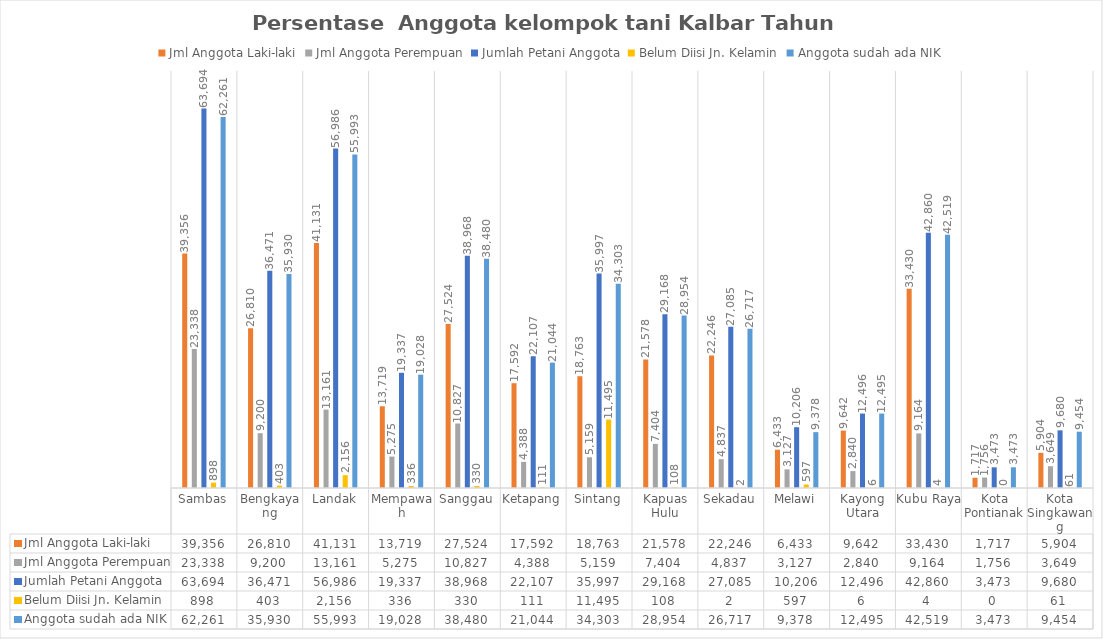
| Category | Jml Anggota Laki-laki | Jml Anggota Perempuan | Jumlah Petani Anggota | Belum Diisi Jn. Kelamin | Anggota sudah ada NIK |
|---|---|---|---|---|---|
| Sambas | 39356 | 23338 | 63694 | 898 | 62261 |
| Bengkayang | 26810 | 9200 | 36471 | 403 | 35930 |
| Landak | 41131 | 13161 | 56986 | 2156 | 55993 |
| Mempawah | 13719 | 5275 | 19337 | 336 | 19028 |
| Sanggau | 27524 | 10827 | 38968 | 330 | 38480 |
| Ketapang | 17592 | 4388 | 22107 | 111 | 21044 |
| Sintang | 18763 | 5159 | 35997 | 11495 | 34303 |
| Kapuas Hulu | 21578 | 7404 | 29168 | 108 | 28954 |
| Sekadau | 22246 | 4837 | 27085 | 2 | 26717 |
| Melawi | 6433 | 3127 | 10206 | 597 | 9378 |
| Kayong Utara | 9642 | 2840 | 12496 | 6 | 12495 |
| Kubu Raya | 33430 | 9164 | 42860 | 4 | 42519 |
| Kota Pontianak | 1717 | 1756 | 3473 | 0 | 3473 |
| Kota Singkawang | 5904 | 3649 | 9680 | 61 | 9454 |